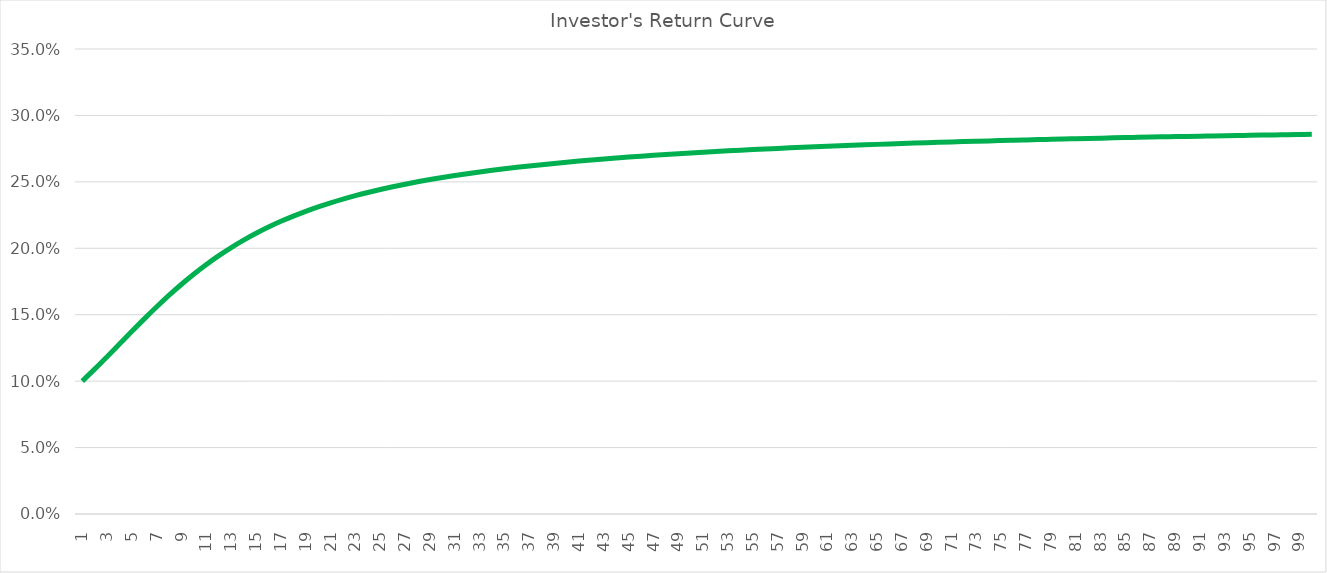
| Category | Investor's Return Curve |
|---|---|
| 1.0 | 0.1 |
| 2.0 | 0.109 |
| 3.0 | 0.118 |
| 4.0 | 0.128 |
| 5.0 | 0.137 |
| 6.0 | 0.147 |
| 7.0 | 0.156 |
| 8.0 | 0.165 |
| 9.0 | 0.173 |
| 10.0 | 0.181 |
| 11.0 | 0.188 |
| 12.0 | 0.194 |
| 13.0 | 0.201 |
| 14.0 | 0.206 |
| 15.0 | 0.211 |
| 16.0 | 0.216 |
| 17.0 | 0.22 |
| 18.0 | 0.224 |
| 19.0 | 0.228 |
| 20.0 | 0.231 |
| 21.0 | 0.234 |
| 22.0 | 0.237 |
| 23.0 | 0.24 |
| 24.0 | 0.242 |
| 25.0 | 0.244 |
| 26.0 | 0.246 |
| 27.0 | 0.248 |
| 28.0 | 0.25 |
| 29.0 | 0.252 |
| 30.0 | 0.253 |
| 31.0 | 0.255 |
| 32.0 | 0.256 |
| 33.0 | 0.257 |
| 34.0 | 0.259 |
| 35.0 | 0.26 |
| 36.0 | 0.261 |
| 37.0 | 0.262 |
| 38.0 | 0.263 |
| 39.0 | 0.264 |
| 40.0 | 0.265 |
| 41.0 | 0.266 |
| 42.0 | 0.266 |
| 43.0 | 0.267 |
| 44.0 | 0.268 |
| 45.0 | 0.269 |
| 46.0 | 0.269 |
| 47.0 | 0.27 |
| 48.0 | 0.271 |
| 49.0 | 0.271 |
| 50.0 | 0.272 |
| 51.0 | 0.272 |
| 52.0 | 0.273 |
| 53.0 | 0.273 |
| 54.0 | 0.274 |
| 55.0 | 0.274 |
| 56.0 | 0.275 |
| 57.0 | 0.275 |
| 58.0 | 0.276 |
| 59.0 | 0.276 |
| 60.0 | 0.276 |
| 61.0 | 0.277 |
| 62.0 | 0.277 |
| 63.0 | 0.278 |
| 64.0 | 0.278 |
| 65.0 | 0.278 |
| 66.0 | 0.279 |
| 67.0 | 0.279 |
| 68.0 | 0.279 |
| 69.0 | 0.279 |
| 70.0 | 0.28 |
| 71.0 | 0.28 |
| 72.0 | 0.28 |
| 73.0 | 0.281 |
| 74.0 | 0.281 |
| 75.0 | 0.281 |
| 76.0 | 0.281 |
| 77.0 | 0.282 |
| 78.0 | 0.282 |
| 79.0 | 0.282 |
| 80.0 | 0.282 |
| 81.0 | 0.282 |
| 82.0 | 0.283 |
| 83.0 | 0.283 |
| 84.0 | 0.283 |
| 85.0 | 0.283 |
| 86.0 | 0.283 |
| 87.0 | 0.284 |
| 88.0 | 0.284 |
| 89.0 | 0.284 |
| 90.0 | 0.284 |
| 91.0 | 0.284 |
| 92.0 | 0.285 |
| 93.0 | 0.285 |
| 94.0 | 0.285 |
| 95.0 | 0.285 |
| 96.0 | 0.285 |
| 97.0 | 0.285 |
| 98.0 | 0.286 |
| 99.0 | 0.286 |
| 100.0 | 0.286 |